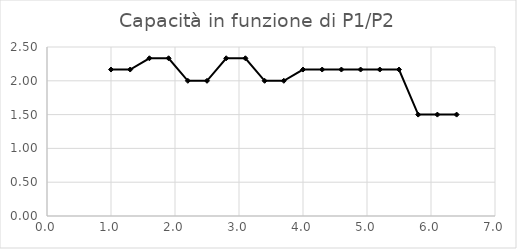
| Category | Series 0 |
|---|---|
| 1.0 | 2.167 |
| 1.3 | 2.167 |
| 1.6 | 2.333 |
| 1.9000000000000001 | 2.333 |
| 2.2 | 2 |
| 2.5 | 2 |
| 2.8 | 2.333 |
| 3.0999999999999996 | 2.333 |
| 3.3999999999999995 | 2 |
| 3.6999999999999993 | 2 |
| 3.999999999999999 | 2.167 |
| 4.299999999999999 | 2.167 |
| 4.599999999999999 | 2.167 |
| 4.899999999999999 | 2.167 |
| 5.199999999999998 | 2.167 |
| 5.499999999999998 | 2.167 |
| 5.799999999999998 | 1.5 |
| 6.099999999999998 | 1.5 |
| 6.399999999999998 | 1.5 |